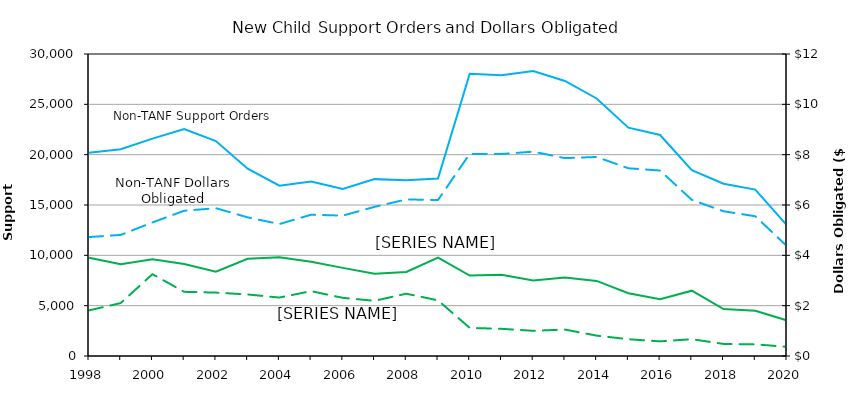
| Category | TANF Support Orders | Non_TANF Support Orders |
|---|---|---|
| 1998 | 9769 | 20192 |
| 1999 | 9127 | 20536 |
| 2000 | 9603 | 21590 |
| 2001 | 9138 | 22554 |
| 2002 | 8373 | 21353 |
| 2003 | 9650 | 18611 |
| 2004 | 9811 | 16914 |
| 2005 | 9365 | 17335 |
| 2006 | 8753 | 16584 |
| 2007 | 8162 | 17570 |
| 2008 | 8352 | 17461 |
| 2009 | 9780 | 17622 |
| 2010 | 7990 | 28036 |
| 2011 | 8066 | 27892 |
| 2012 | 7492 | 28303 |
| 2013 | 7803 | 27320 |
| 2014 | 7459 | 25581 |
| 2015 | 6232 | 22683 |
| 2016 | 5647 | 21955 |
| 2017 | 6488 | 18465 |
| 2018 | 4660 | 17117 |
| 2019 | 4500 | 16527 |
| 2020 | 3535.497 | 12986.503 |